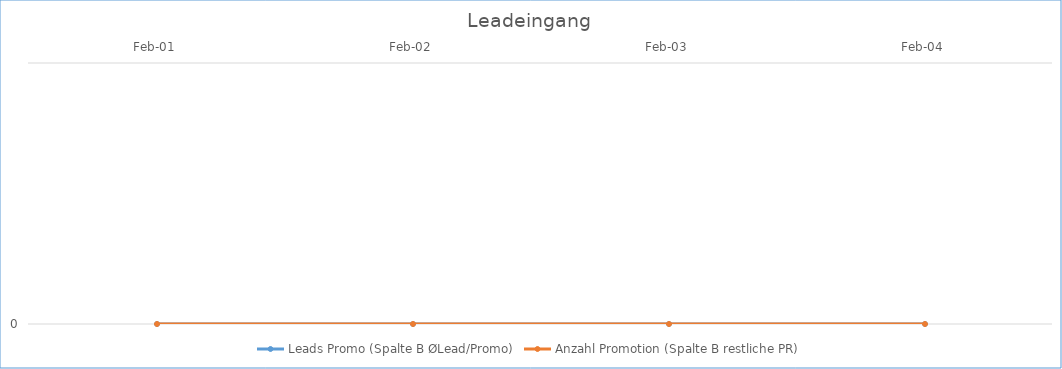
| Category | Leads Promo (Spalte B ØLead/Promo) | Anzahl Promotion (Spalte B restliche PR) |
|---|---|---|
| 2001-02-01 | 0 | 0 |
| 2002-02-01 | 0 | 0 |
| 2003-02-01 | 0 | 0 |
| 2004-02-01 | 0 | 0 |